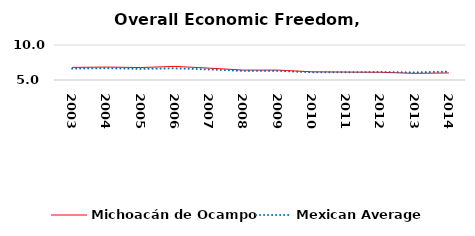
| Category | Michoacán de Ocampo | Mexican Average  |
|---|---|---|
| 2003.0 | 6.797 | 6.632 |
| 2004.0 | 6.849 | 6.678 |
| 2005.0 | 6.78 | 6.582 |
| 2006.0 | 6.943 | 6.668 |
| 2007.0 | 6.694 | 6.508 |
| 2008.0 | 6.413 | 6.3 |
| 2009.0 | 6.415 | 6.3 |
| 2010.0 | 6.172 | 6.105 |
| 2011.0 | 6.132 | 6.103 |
| 2012.0 | 6.104 | 6.144 |
| 2013.0 | 5.951 | 6.087 |
| 2014.0 | 6.008 | 6.195 |